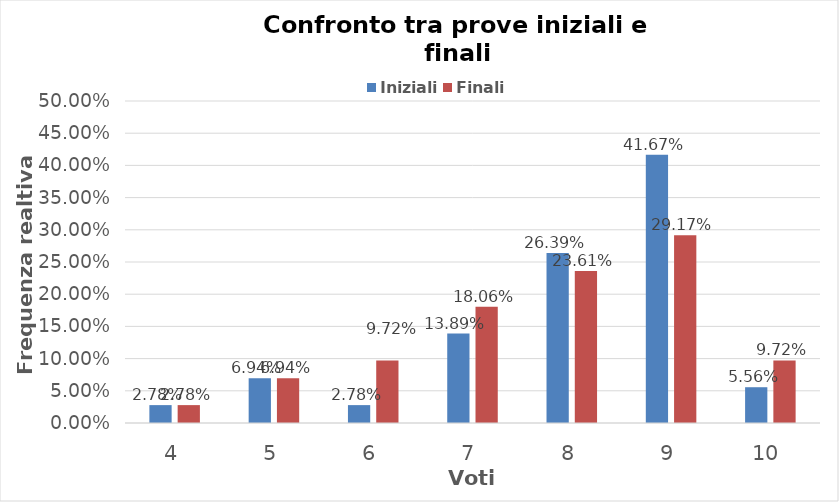
| Category | Iniziali | Finali |
|---|---|---|
| 4.0 | 0.028 | 0.028 |
| 5.0 | 0.069 | 0.069 |
| 6.0 | 0.028 | 0.097 |
| 7.0 | 0.139 | 0.181 |
| 8.0 | 0.264 | 0.236 |
| 9.0 | 0.417 | 0.292 |
| 10.0 | 0.056 | 0.097 |